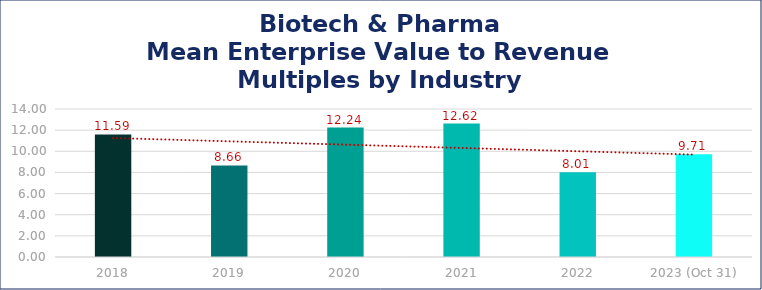
| Category | Biotech & Pharma |
|---|---|
| 2018 | 11.59 |
| 2019 | 8.66 |
| 2020 | 12.24 |
| 2021 | 12.62 |
| 2022 | 8.01 |
| 2023 (Oct 31) | 9.71 |